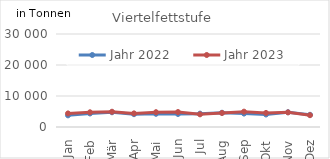
| Category | Jahr 2022 | Jahr 2023 |
|---|---|---|
| 0 | 3758.506 | 4377.989 |
| 1 | 4365.349 | 4747.146 |
| 2 | 4753.705 | 4925.657 |
| 3 | 4136.753 | 4394.626 |
| 4 | 4258.828 | 4776.906 |
| 5 | 4200.273 | 4824.743 |
| 6 | 4311.122 | 4084.234 |
| 7 | 4592.239 | 4526.504 |
| 8 | 4336.191 | 4954.122 |
| 9 | 4034.648 | 4540.982 |
| 10 | 4770.889 | 4719.517 |
| 11 | 3935.352 | 3811.37 |